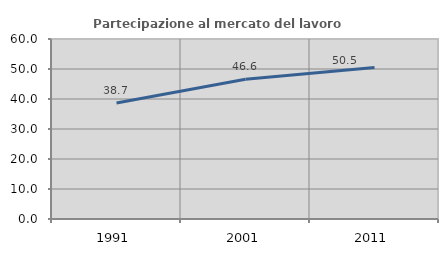
| Category | Partecipazione al mercato del lavoro  femminile |
|---|---|
| 1991.0 | 38.655 |
| 2001.0 | 46.589 |
| 2011.0 | 50.516 |